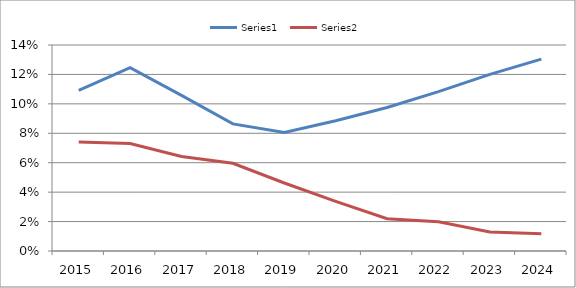
| Category | Series 0 | Series 1 |
|---|---|---|
| 2015.0 | 0.109 | 0.074 |
| 2016.0 | 0.125 | 0.073 |
| 2017.0 | 0.106 | 0.064 |
| 2018.0 | 0.086 | 0.06 |
| 2019.0 | 0.081 | 0.046 |
| 2020.0 | 0.088 | 0.034 |
| 2021.0 | 0.098 | 0.022 |
| 2022.0 | 0.108 | 0.02 |
| 2023.0 | 0.12 | 0.013 |
| 2024.0 | 0.13 | 0.012 |